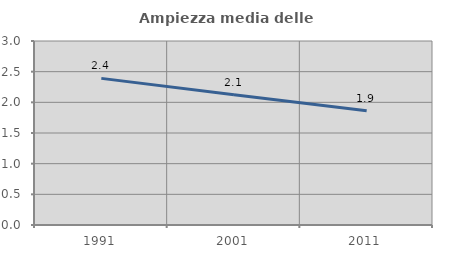
| Category | Ampiezza media delle famiglie |
|---|---|
| 1991.0 | 2.391 |
| 2001.0 | 2.124 |
| 2011.0 | 1.863 |